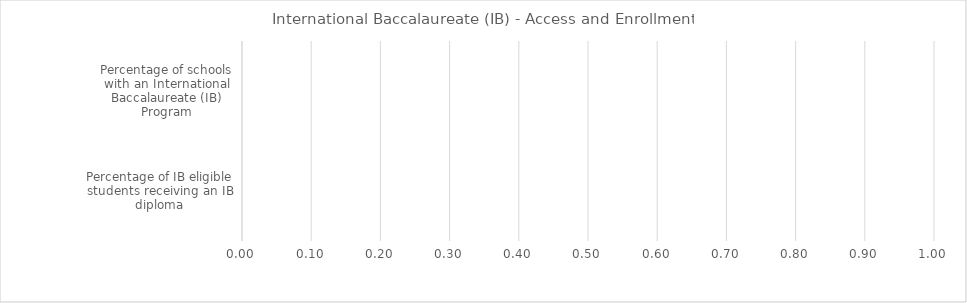
| Category | Benchmark | Entire LEA  | Title IV-A Identified Schools |
|---|---|---|---|
| Percentage of schools with an International Baccalaureate (IB) Program | 0 | 0 | 0 |
| Percentage of IB eligible students receiving an IB diploma | 0 | 0 | 0 |